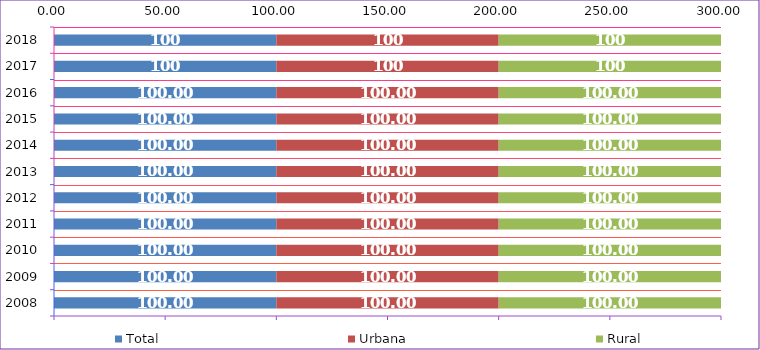
| Category | Total | Urbana | Rural |
|---|---|---|---|
| 2008.0 | 100 | 100 | 100 |
| 2009.0 | 100 | 100 | 100 |
| 2010.0 | 100 | 100 | 100 |
| 2011.0 | 100 | 100 | 100 |
| 2012.0 | 100 | 100 | 100 |
| 2013.0 | 100 | 100 | 100 |
| 2014.0 | 100 | 100 | 100 |
| 2015.0 | 100 | 100 | 100 |
| 2016.0 | 100 | 100 | 100 |
| 2017.0 | 100 | 100 | 100 |
| 2018.0 | 100 | 100 | 100 |